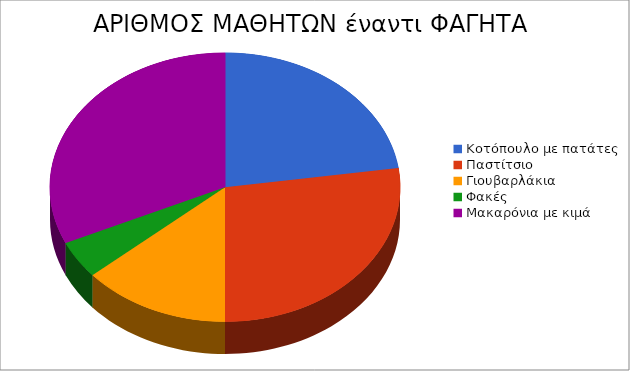
| Category | ΑΡΙΘΜΟΣ ΜΑΘΗΤΩΝ |
|---|---|
| Κοτόπουλο με πατάτες | 5 |
| Παστίτσιο | 6 |
| Γιουβαρλάκια | 3 |
| Φακές | 1 |
| Μακαρόνια με κιμά | 7 |